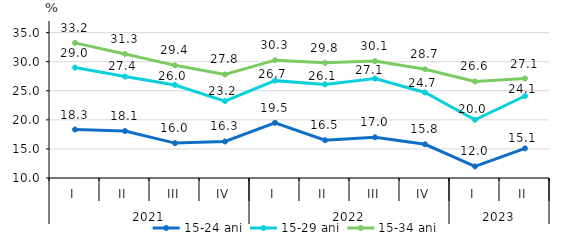
| Category | 15-24 ani | 15-29 ani | 15-34 ani |
|---|---|---|---|
| 0 | 18.335 | 28.999 | 33.235 |
| 1 | 18.083 | 27.448 | 31.318 |
| 2 | 16 | 26 | 29.373 |
| 3 | 16.283 | 23.232 | 27.8 |
| 4 | 19.497 | 26.744 | 30.262 |
| 5 | 16.5 | 26.1 | 29.8 |
| 6 | 17 | 27.1 | 30.1 |
| 7 | 15.8 | 24.7 | 28.7 |
| 8 | 12 | 20 | 26.6 |
| 9 | 15.1 | 24.1 | 27.1 |